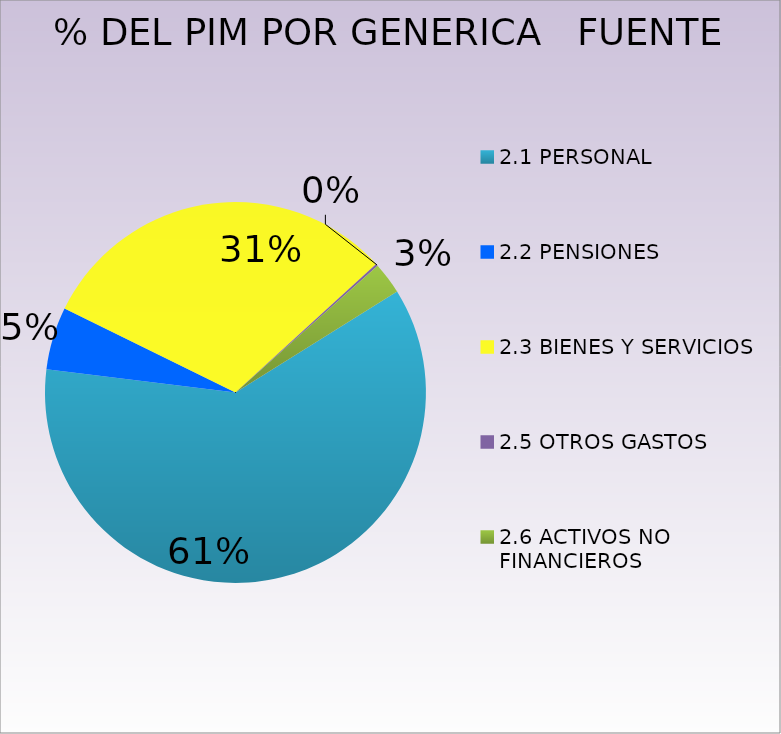
| Category | Series 0 |
|---|---|
| 2.1 PERSONAL | 26927333 |
| 2.2 PENSIONES | 2356422 |
| 2.3 BIENES Y SERVICIOS | 13695006 |
| 2.5 OTROS GASTOS  | 81309 |
| 2.6 ACTIVOS NO FINANCIEROS  | 1198556 |